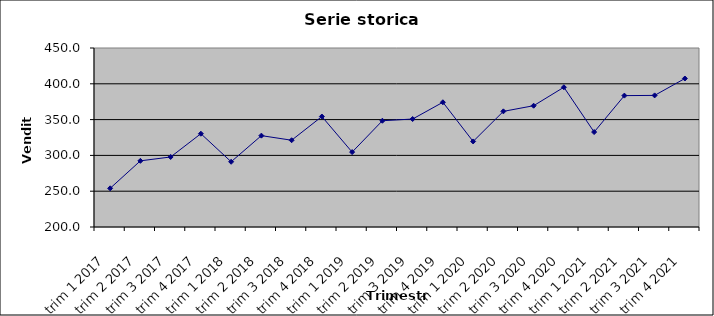
| Category | y |
|---|---|
| trim 1 2017 | 254 |
| trim 2 2017 | 292.4 |
| trim 3 2017 | 297.8 |
| trim 4 2017 | 330.3 |
| trim 1 2018 | 291.1 |
| trim 2 2018 | 327.6 |
| trim 3 2018 | 321.2 |
| trim 4 2018 | 354.3 |
| trim 1 2019 | 304.6 |
| trim 2 2019 | 348.4 |
| trim 3 2019 | 350.8 |
| trim 4 2019 | 374.2 |
| trim 1 2020 | 319.5 |
| trim 2 2020 | 361.5 |
| trim 3 2020 | 369.4 |
| trim 4 2020 | 395.2 |
| trim 1 2021 | 332.6 |
| trim 2 2021 | 383.5 |
| trim 3 2021 | 383.8 |
| trim 4 2021 | 407.4 |